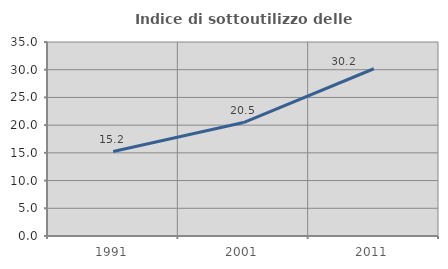
| Category | Indice di sottoutilizzo delle abitazioni  |
|---|---|
| 1991.0 | 15.242 |
| 2001.0 | 20.472 |
| 2011.0 | 30.175 |